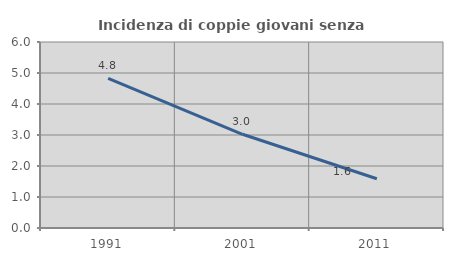
| Category | Incidenza di coppie giovani senza figli |
|---|---|
| 1991.0 | 4.83 |
| 2001.0 | 3.023 |
| 2011.0 | 1.587 |